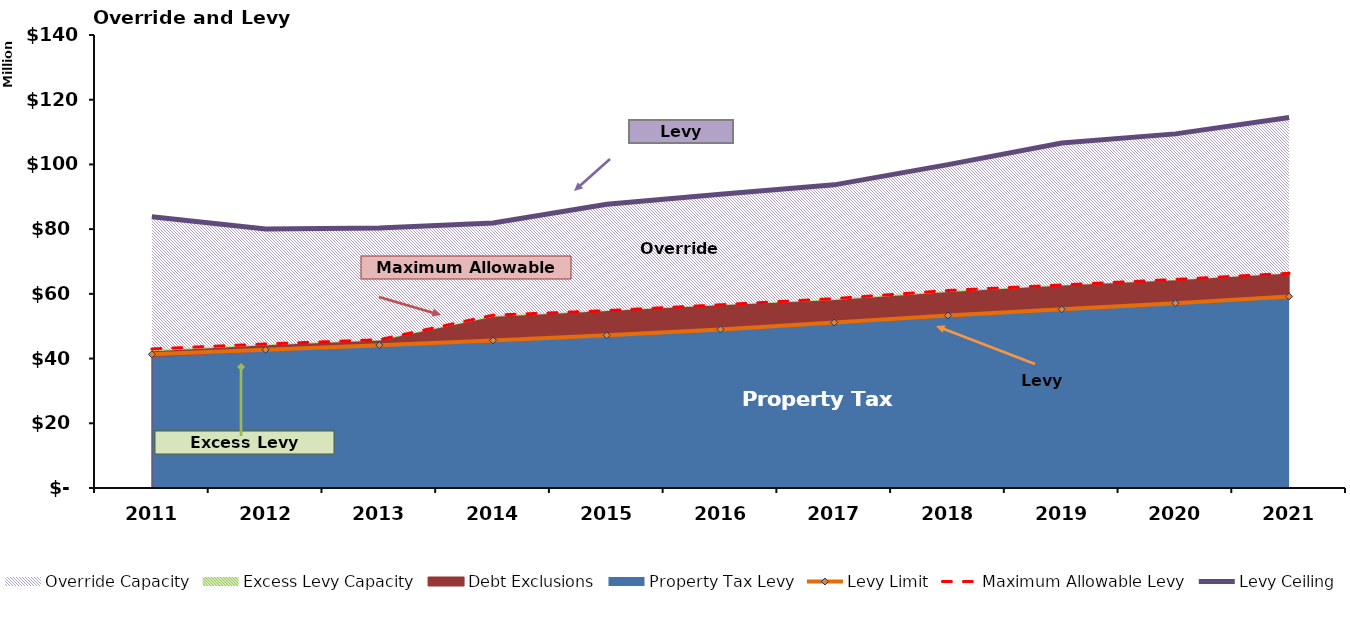
| Category | Levy Ceiling | Maximum Allowable Levy | Levy Limit |
|---|---|---|---|
| 2011.0 | 83822080 | 42969019.5 | 41306011.5 |
| 2012.0 | 80015883 | 44506300.788 | 42716207.788 |
| 2013.0 | 80366692 | 45823556.982 | 44149708.982 |
| 2014.0 | 81913441 | 53408199.707 | 45616000.707 |
| 2015.0 | 87660517 | 54819920.724 | 47190674.724 |
| 2016.0 | 90798118 | 56628318.593 | 49001917.593 |
| 2017.0 | 93692696 | 58527783.657 | 51143781.657 |
| 2018.0 | 99950449 | 61039828.974 | 53293996.974 |
| 2019.0 | 106602127 | 62745200.898 | 55206581.898 |
| 2020.0 | 109441421 | 64459921.446 | 57123109.446 |
| 2021.0 | 114494462 | 66354609.182 | 59197320.182 |